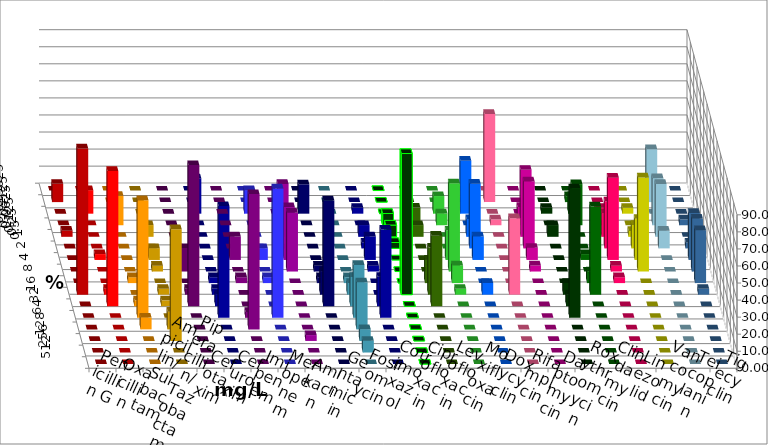
| Category | Penicillin G | Oxacillin | Ampicillin/ Sulbactam | Piperacillin/ Tazobactam | Cefotaxim | Cefuroxim | Imipenem | Meropenem | Amikacin | Gentamicin | Fosfomycin | Cotrimoxazol | Ciprofloxacin | Levofloxacin | Moxifloxacin | Doxycyclin | Rifampicin | Daptomycin | Roxythromycin | Clindamycin | Linezolid | Vancomycin | Teicoplanin | Tigecyclin |
|---|---|---|---|---|---|---|---|---|---|---|---|---|---|---|---|---|---|---|---|---|---|---|---|---|
| 0.015625 | 0 | 0 | 0 | 0 | 0 | 0 | 0 | 0 | 0 | 0 | 0 | 0 | 0 | 0 | 0 | 0 | 0 | 0 | 0 | 0 | 0 | 0 | 0 | 0 |
| 0.03125 | 10.714 | 0 | 0 | 0 | 0 | 0 | 0 | 0 | 0 | 0 | 0 | 0 | 0 | 0 | 0 | 0 | 51.724 | 0 | 0 | 3.448 | 0 | 0 | 0 | 31.034 |
| 0.0625 | 0 | 13.793 | 0 | 0 | 0 | 0 | 20.69 | 13.793 | 0 | 17.241 | 0 | 3.448 | 0 | 0 | 10.345 | 31.034 | 0 | 0 | 3.448 | 10.345 | 3.448 | 3.448 | 0 | 0 |
| 0.125 | 0 | 0 | 17.241 | 0 | 0 | 0 | 0 | 0 | 0 | 0 | 0 | 0 | 6.897 | 10.345 | 6.897 | 0 | 3.448 | 10.714 | 0 | 24.138 | 0 | 0 | 3.448 | 27.586 |
| 0.25 | 3.571 | 0 | 0 | 6.897 | 0 | 0 | 0 | 0 | 31.034 | 0 | 0 | 6.897 | 6.897 | 6.897 | 0 | 10.345 | 0 | 39.286 | 6.897 | 0 | 13.793 | 3.448 | 0 | 31.034 |
| 0.5 | 0 | 0 | 0 | 0 | 0 | 0 | 0 | 0 | 0 | 0 | 0 | 3.448 | 3.448 | 0 | 0 | 37.931 | 0 | 39.286 | 0 | 0 | 27.586 | 13.793 | 3.448 | 10.345 |
| 1.0 | 0 | 3.448 | 0 | 6.897 | 0 | 13.793 | 0 | 6.897 | 31.034 | 0 | 0 | 13.793 | 0 | 0 | 17.241 | 13.793 | 0 | 7.143 | 0 | 3.448 | 48.276 | 24.138 | 27.586 | 0 |
| 2.0 | 0 | 0 | 0 | 3.448 | 13.793 | 0 | 0 | 0 | 34.483 | 3.448 | 0 | 3.448 | 0 | 0 | 51.724 | 0 | 0 | 3.571 | 0 | 0 | 3.448 | 55.172 | 31.034 | 0 |
| 4.0 | 0 | 0 | 3.448 | 0 | 0 | 3.448 | 3.448 | 3.448 | 0 | 3.448 | 3.448 | 0 | 0 | 13.793 | 10.345 | 0 | 0 | 0 | 0 | 6.897 | 3.448 | 0 | 31.034 | 0 |
| 8.0 | 85.714 | 3.448 | 0 | 3.448 | 3.448 | 0 | 3.448 | 0 | 0 | 13.793 | 6.897 | 0 | 82.759 | 27.586 | 3.448 | 6.897 | 44.828 | 0 | 6.897 | 51.724 | 0 | 0 | 3.448 | 0 |
| 16.0 | 0 | 79.31 | 3.448 | 3.448 | 82.759 | 0 | 6.897 | 0 | 0 | 62.069 | 17.241 | 17.241 | 0 | 41.379 | 0 | 0 | 0 | 0 | 6.897 | 0 | 0 | 0 | 0 | 0 |
| 32.0 | 0 | 0 | 68.966 | 0 | 0 | 3.448 | 65.517 | 75.862 | 0 | 0 | 31.034 | 51.724 | 0 | 0 | 0 | 0 | 0 | 0 | 75.862 | 0 | 0 | 0 | 0 | 0 |
| 64.0 | 0 | 0 | 6.897 | 10.345 | 0 | 79.31 | 0 | 0 | 0 | 0 | 27.586 | 0 | 0 | 0 | 0 | 0 | 0 | 0 | 0 | 0 | 0 | 0 | 0 | 0 |
| 128.0 | 0 | 0 | 0 | 65.517 | 0 | 0 | 0 | 0 | 3.448 | 0 | 6.897 | 0 | 0 | 0 | 0 | 0 | 0 | 0 | 0 | 0 | 0 | 0 | 0 | 0 |
| 256.0 | 0 | 0 | 0 | 0 | 0 | 0 | 0 | 0 | 0 | 0 | 6.897 | 0 | 0 | 0 | 0 | 0 | 0 | 0 | 0 | 0 | 0 | 0 | 0 | 0 |
| 512.0 | 0 | 0 | 0 | 0 | 0 | 0 | 0 | 0 | 0 | 0 | 0 | 0 | 0 | 0 | 0 | 0 | 0 | 0 | 0 | 0 | 0 | 0 | 0 | 0 |